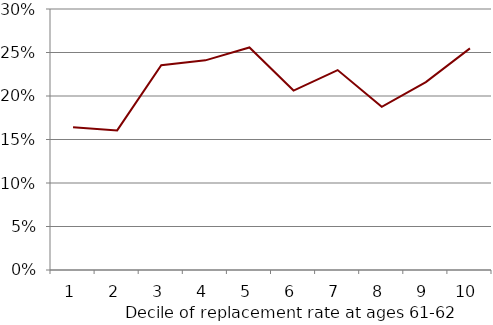
| Category | Share with any nontraditional work after age 62 |
|---|---|
| 0 | 0.164 |
| 1 | 0.16 |
| 2 | 0.235 |
| 3 | 0.241 |
| 4 | 0.256 |
| 5 | 0.206 |
| 6 | 0.23 |
| 7 | 0.188 |
| 8 | 0.216 |
| 9 | 0.255 |